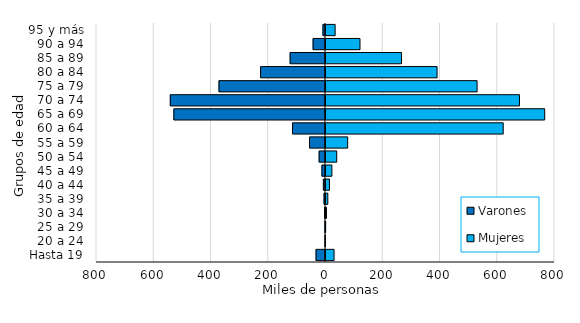
| Category | Varones | Mujeres |
|---|---|---|
| Hasta 19 | -33045 | 31623 |
| 20 a 24 | -1064 | 1051 |
| 25 a 29 | -1513 | 2289 |
| 30 a 34 | -2562 | 5121 |
| 35 a 39 | -5052 | 9876 |
| 40 a 44 | -7346 | 15545 |
| 45 a 49 | -12425 | 24088 |
| 50 a 54 | -22142 | 40872 |
| 55 a 59 | -55768 | 79133 |
| 60 a 64 | -115210 | 622595 |
| 65 a 69 | -529738 | 767517 |
| 70 a 74 | -542117 | 679343 |
| 75 a 79 | -372071 | 531369 |
| 80 a 84 | -226891 | 391551 |
| 85 a 89 | -123494 | 267398 |
| 90 a 94 | -43368 | 122220 |
| 95 y más | -8920 | 35388 |